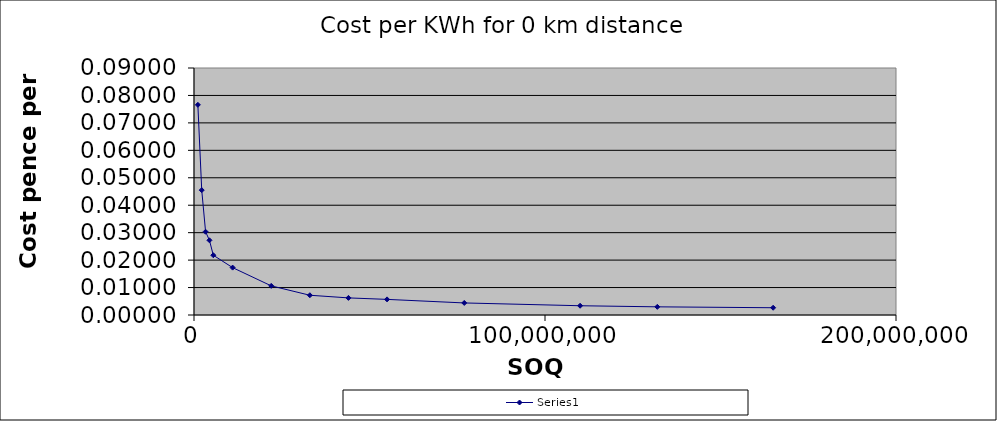
| Category | Series 0 |
|---|---|
| 165000000.0 | 0.003 |
| 132000000.0 | 0.003 |
| 110000000.0 | 0.003 |
| 77000000.0 | 0.004 |
| 55000000.0 | 0.006 |
| 44000000.0 | 0.006 |
| 33000000.0 | 0.007 |
| 22000000.0 | 0.011 |
| 11000000.0 | 0.017 |
| 5500000.0 | 0.022 |
| 4400000.0 | 0.027 |
| 3300000.0 | 0.03 |
| 2200000.0 | 0.045 |
| 1100000.0 | 0.077 |